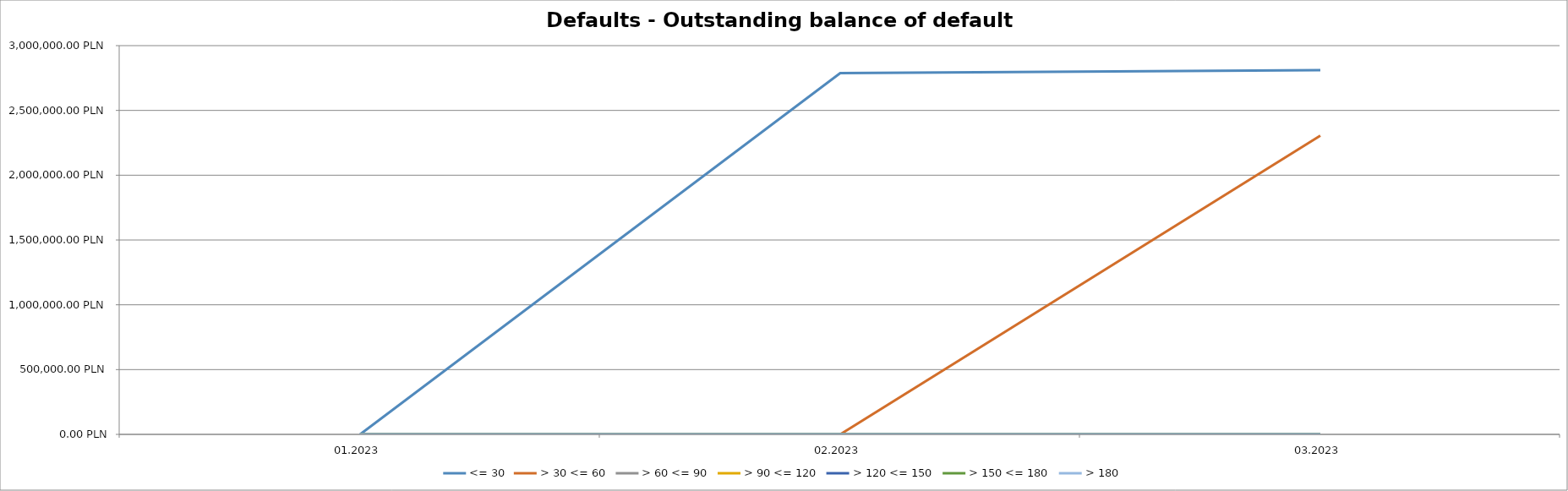
| Category | <= 30 | > 30 <= 60 | > 60 <= 90 | > 90 <= 120 | > 120 <= 150 | > 150 <= 180 | > 180 |
|---|---|---|---|---|---|---|---|
| 01.2023 | 0 | 0 | 0 | 0 | 0 | 0 | 0 |
| 02.2023 | 2788519.82 | 0 | 0 | 0 | 0 | 0 | 0 |
| 03.2023 | 2811517.14 | 2305154.07 | 0 | 0 | 0 | 0 | 0 |